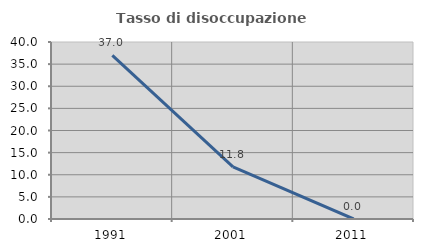
| Category | Tasso di disoccupazione giovanile  |
|---|---|
| 1991.0 | 36.957 |
| 2001.0 | 11.765 |
| 2011.0 | 0 |